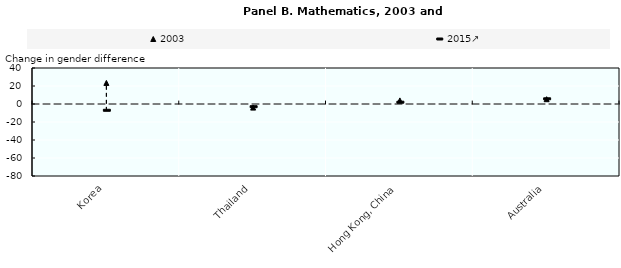
| Category | 2003 | 2015↗ |
|---|---|---|
| Korea | 23.406 | -6.99 |
| Thailand | -4 | -3 |
| Hong Kong, China | 4 | 2 |
| Australia | 5.342 | 5.776 |